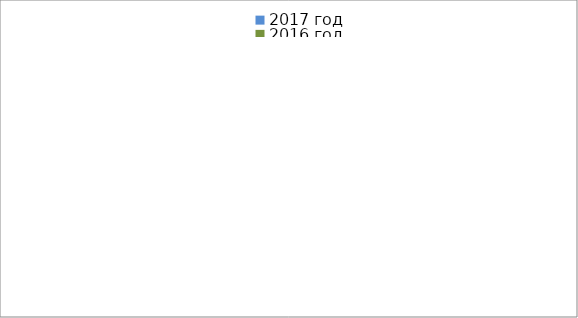
| Category | 2017 год | 2016 год |
|---|---|---|
|  - поджог | 12 | 31 |
|  - неосторожное обращение с огнём | 5 | 20 |
|  - НПТЭ электрооборудования | 13 | 14 |
|  - НПУ и Э печей | 34 | 30 |
|  - НПУ и Э транспортных средств | 41 | 21 |
|   -Шалость с огнем детей | 3 | 5 |
|  -НППБ при эксплуатации эл.приборов | 21 | 7 |
|  - курение | 28 | 13 |
| - прочие | 60 | 92 |
| - не установленные причины | 0 | 11 |